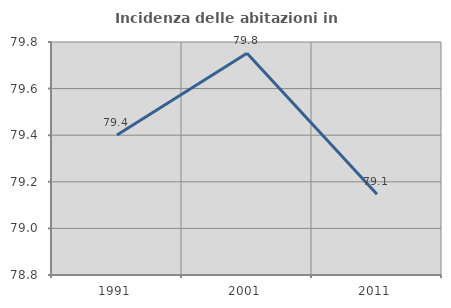
| Category | Incidenza delle abitazioni in proprietà  |
|---|---|
| 1991.0 | 79.401 |
| 2001.0 | 79.752 |
| 2011.0 | 79.147 |